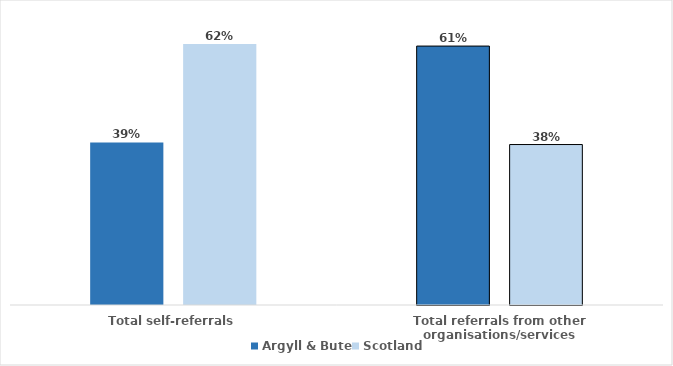
| Category | Argyll & Bute | Scotland |
|---|---|---|
| Total self-referrals | 0.386 | 0.619 |
| Total referrals from other organisations/services | 0.614 | 0.381 |